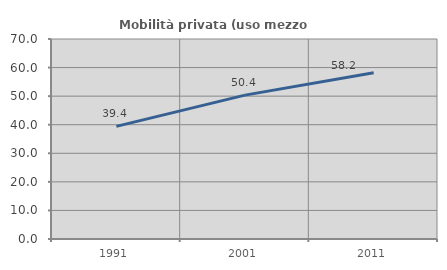
| Category | Mobilità privata (uso mezzo privato) |
|---|---|
| 1991.0 | 39.406 |
| 2001.0 | 50.359 |
| 2011.0 | 58.165 |